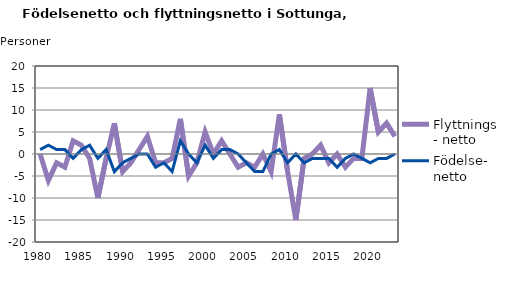
| Category | Flyttnings- netto | Födelse- netto |
|---|---|---|
| 1980.0 | 0 | 1 |
| 1981.0 | -6 | 2 |
| 1982.0 | -2 | 1 |
| 1983.0 | -3 | 1 |
| 1984.0 | 3 | -1 |
| 1985.0 | 2 | 1 |
| 1986.0 | -1 | 2 |
| 1987.0 | -10 | -1 |
| 1988.0 | -1 | 1 |
| 1989.0 | 7 | -4 |
| 1990.0 | -4 | -2 |
| 1991.0 | -2 | -1 |
| 1992.0 | 1 | 0 |
| 1993.0 | 4 | 0 |
| 1994.0 | -2 | -3 |
| 1995.0 | -2 | -2 |
| 1996.0 | -1 | -4 |
| 1997.0 | 8 | 3 |
| 1998.0 | -5 | 0 |
| 1999.0 | -2 | -2 |
| 2000.0 | 5 | 2 |
| 2001.0 | 0 | -1 |
| 2002.0 | 3 | 1 |
| 2003.0 | 0 | 1 |
| 2004.0 | -3 | 0 |
| 2005.0 | -2 | -2 |
| 2006.0 | -3 | -4 |
| 2007.0 | 0 | -4 |
| 2008.0 | -4 | 0 |
| 2009.0 | 9 | 1 |
| 2010.0 | -4 | -2 |
| 2011.0 | -15 | 0 |
| 2012.0 | -1 | -2 |
| 2013.0 | 0 | -1 |
| 2014.0 | 2 | -1 |
| 2015.0 | -2 | -1 |
| 2016.0 | 0 | -3 |
| 2017.0 | -3 | -1 |
| 2018.0 | -1 | 0 |
| 2019.0 | -1 | -1 |
| 2020.0 | 15 | -2 |
| 2021.0 | 5 | -1 |
| 2022.0 | 7 | -1 |
| 2023.0 | 4 | 0 |